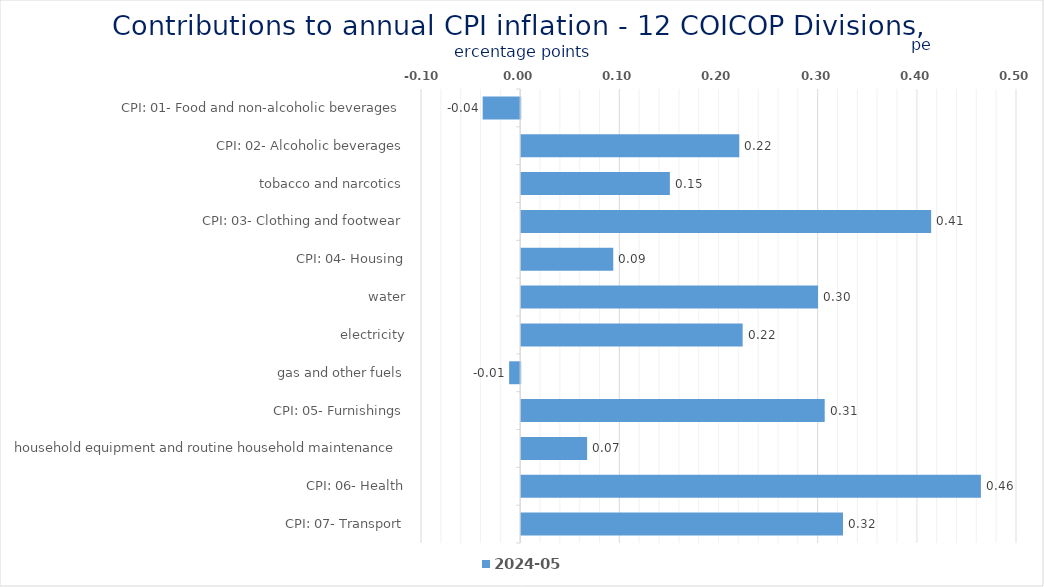
| Category | 2024-05 |
|---|---|
| CPI: 01- Food and non-alcoholic beverages | -0.038 |
| CPI: 02- Alcoholic beverages, tobacco and narcotics | 0.22 |
| CPI: 03- Clothing and footwear | 0.15 |
| CPI: 04- Housing, water, electricity, gas and other fuels | 0.413 |
| CPI: 05- Furnishings, household equipment and routine household maintenance | 0.093 |
| CPI: 06- Health | 0.299 |
| CPI: 07- Transport | 0.223 |
| CPI: 08- Communication | -0.011 |
| CPI: 09- Recreation and culture | 0.306 |
| CPI: 10- Education | 0.067 |
| CPI: 11- Restaurants and hotels | 0.464 |
| CPI: 12- Miscellaneous goods and services | 0.325 |